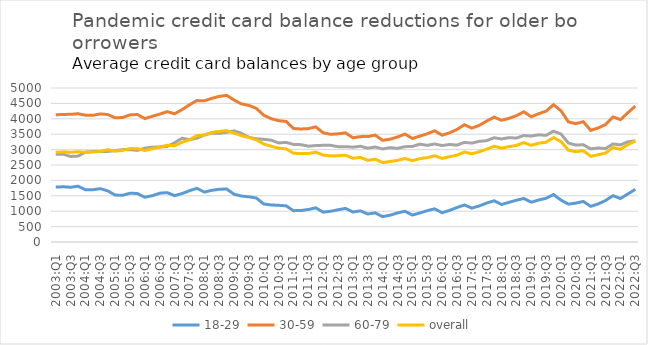
| Category | 18-29 | 30-59 | 60-79 | overall |
|---|---|---|---|---|
| 2003:Q1 | 1781.965 | 4128.752 | 2845.002 | 2912.225 |
| 2003:Q2 | 1793.054 | 4142.717 | 2851.386 | 2923.928 |
| 2003:Q3 | 1777.186 | 4144.515 | 2776.959 | 2913.638 |
| 2003:Q4 | 1810.962 | 4165.909 | 2789.429 | 2928.933 |
| 2004:Q1 | 1696.951 | 4118.018 | 2917.665 | 2910.933 |
| 2004:Q2 | 1696.254 | 4113.043 | 2936.575 | 2924.157 |
| 2004:Q3 | 1731.959 | 4159.262 | 2938.372 | 2942.484 |
| 2004:Q4 | 1659.492 | 4138.531 | 2940.767 | 2997.091 |
| 2005:Q1 | 1523.781 | 4033.134 | 2969.254 | 2948.426 |
| 2005:Q2 | 1518.266 | 4041.773 | 2999.534 | 2972.939 |
| 2005:Q3 | 1583.184 | 4128.239 | 2998.856 | 3032.259 |
| 2005:Q4 | 1575.01 | 4138.409 | 2974.558 | 3031.068 |
| 2006:Q1 | 1453.573 | 4006.225 | 3045.144 | 2970.499 |
| 2006:Q2 | 1504.361 | 4081.213 | 3079.259 | 3028.574 |
| 2006:Q3 | 1584.652 | 4152.419 | 3081.803 | 3084.525 |
| 2006:Q4 | 1602.327 | 4232.44 | 3104.101 | 3139.657 |
| 2007:Q1 | 1505.29 | 4162.606 | 3223.749 | 3126.243 |
| 2007:Q2 | 1572.964 | 4297.997 | 3369.546 | 3239.522 |
| 2007:Q3 | 1664.814 | 4453.578 | 3320.814 | 3317.491 |
| 2007:Q4 | 1743.076 | 4592.888 | 3372.549 | 3455.009 |
| 2008:Q1 | 1621.732 | 4582.771 | 3472.705 | 3475.045 |
| 2008:Q2 | 1678.068 | 4664.042 | 3536.242 | 3557.67 |
| 2008:Q3 | 1712.156 | 4728.491 | 3528.269 | 3591.064 |
| 2008:Q4 | 1720.028 | 4761.649 | 3558.671 | 3615.881 |
| 2009:Q1 | 1552.056 | 4610.214 | 3608.085 | 3532.82 |
| 2009:Q2 | 1492.091 | 4481.809 | 3529.231 | 3453.809 |
| 2009:Q3 | 1466.894 | 4434.032 | 3396.957 | 3393.792 |
| 2009:Q4 | 1428.292 | 4337.824 | 3352.007 | 3317.448 |
| 2010:Q1 | 1234.028 | 4114.615 | 3333.692 | 3180.085 |
| 2010:Q2 | 1202.631 | 4003.57 | 3305.881 | 3108.076 |
| 2010:Q3 | 1191.05 | 3938.249 | 3217.082 | 3047.867 |
| 2010:Q4 | 1175.005 | 3915.175 | 3233.178 | 3025.894 |
| 2011:Q1 | 1017.139 | 3684.51 | 3169.055 | 2881.873 |
| 2011:Q2 | 1023.105 | 3669.341 | 3160.74 | 2870.941 |
| 2011:Q3 | 1055.863 | 3681.773 | 3110.302 | 2870.653 |
| 2011:Q4 | 1108.251 | 3738.163 | 3132.046 | 2918.451 |
| 2012:Q1 | 969.4 | 3544.319 | 3139.28 | 2820.098 |
| 2012:Q2 | 998.018 | 3495.279 | 3137.842 | 2796.663 |
| 2012:Q3 | 1046.559 | 3512.755 | 3094.141 | 2800.816 |
| 2012:Q4 | 1091.44 | 3542.313 | 3096.338 | 2817.98 |
| 2013:Q1 | 973.438 | 3382.974 | 3078.972 | 2718.541 |
| 2013:Q2 | 1010.708 | 3421.1 | 3108.812 | 2745.736 |
| 2013:Q3 | 909.072 | 3422.823 | 3047.179 | 2651.995 |
| 2013:Q4 | 945.56 | 3470.534 | 3083.749 | 2688.505 |
| 2014:Q1 | 822.092 | 3299.789 | 3021.125 | 2579.534 |
| 2014:Q2 | 869.999 | 3338.252 | 3065.05 | 2615.868 |
| 2014:Q3 | 942.512 | 3409.394 | 3039.168 | 2649.285 |
| 2014:Q4 | 997.762 | 3504.295 | 3095.578 | 2711.823 |
| 2015:Q1 | 875.626 | 3361.962 | 3101.369 | 2641.336 |
| 2015:Q2 | 941.681 | 3436.419 | 3176.659 | 2706.119 |
| 2015:Q3 | 1017.479 | 3513.751 | 3138.595 | 2738.643 |
| 2015:Q4 | 1076.911 | 3611.17 | 3181.806 | 2799.782 |
| 2016:Q1 | 949.909 | 3466.812 | 3131.391 | 2712.884 |
| 2016:Q2 | 1027.273 | 3544.304 | 3167.725 | 2769.838 |
| 2016:Q3 | 1119.281 | 3652.992 | 3145.19 | 2818.675 |
| 2016:Q4 | 1202.615 | 3807.571 | 3234.792 | 2922.997 |
| 2017:Q1 | 1100.923 | 3697.891 | 3210.113 | 2862.66 |
| 2017:Q2 | 1170.864 | 3785.985 | 3269.13 | 2928.78 |
| 2017:Q3 | 1264.688 | 3926.765 | 3289.457 | 3013.386 |
| 2017:Q4 | 1338.585 | 4052.729 | 3384.469 | 3108.145 |
| 2018:Q1 | 1217.018 | 3952.479 | 3345.106 | 3049.007 |
| 2018:Q2 | 1287.447 | 4013.44 | 3388.257 | 3096.893 |
| 2018:Q3 | 1355.973 | 4101.2 | 3373.997 | 3137.647 |
| 2018:Q4 | 1412.743 | 4228.583 | 3457.446 | 3225.762 |
| 2019:Q1 | 1290.839 | 4064.266 | 3440.778 | 3139.213 |
| 2019:Q2 | 1364.27 | 4165.668 | 3479.667 | 3206.209 |
| 2019:Q3 | 1418.666 | 4247.386 | 3462.995 | 3241.915 |
| 2019:Q4 | 1539.625 | 4458.234 | 3599.223 | 3391.037 |
| 2020:Q1 | 1359.177 | 4258.918 | 3506.636 | 3260.071 |
| 2020:Q2 | 1230.343 | 3899.728 | 3212.57 | 2979.941 |
| 2020:Q3 | 1262.711 | 3842.392 | 3147.059 | 2932.047 |
| 2020:Q4 | 1316.702 | 3905.672 | 3156.586 | 2964.618 |
| 2021:Q1 | 1158.567 | 3623.588 | 3023.41 | 2783.19 |
| 2021:Q2 | 1234.727 | 3704.048 | 3051.406 | 2834.671 |
| 2021:Q3 | 1347.383 | 3812.11 | 3034.442 | 2887.513 |
| 2021:Q4 | 1505.686 | 4061.469 | 3183.568 | 3066.552 |
| 2022:Q1 | 1411.052 | 3972.243 | 3151.268 | 3009.667 |
| 2022:Q2 | 1559.507 | 4197.584 | 3254.228 | 3159.411 |
| 2022:Q3 | 1708.461 | 4412.48 | 3284.404 | 3282.618 |